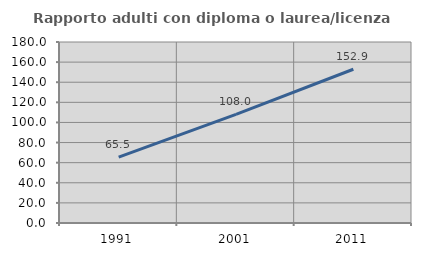
| Category | Rapporto adulti con diploma o laurea/licenza media  |
|---|---|
| 1991.0 | 65.492 |
| 2001.0 | 107.987 |
| 2011.0 | 152.903 |